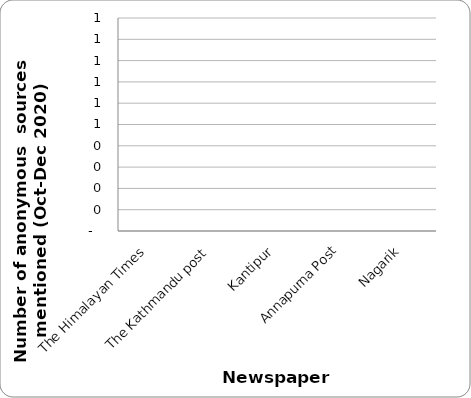
| Category | Education |
|---|---|
| The Himalayan Times | 0 |
| The Kathmandu post | 0 |
| Kantipur | 0 |
| Annapurna Post | 0 |
| Nagarik | 0 |